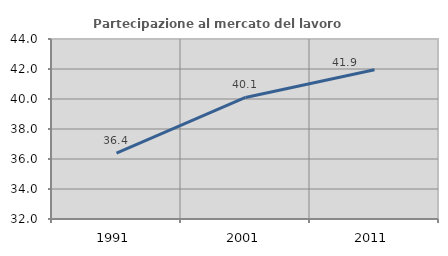
| Category | Partecipazione al mercato del lavoro  femminile |
|---|---|
| 1991.0 | 36.399 |
| 2001.0 | 40.101 |
| 2011.0 | 41.946 |